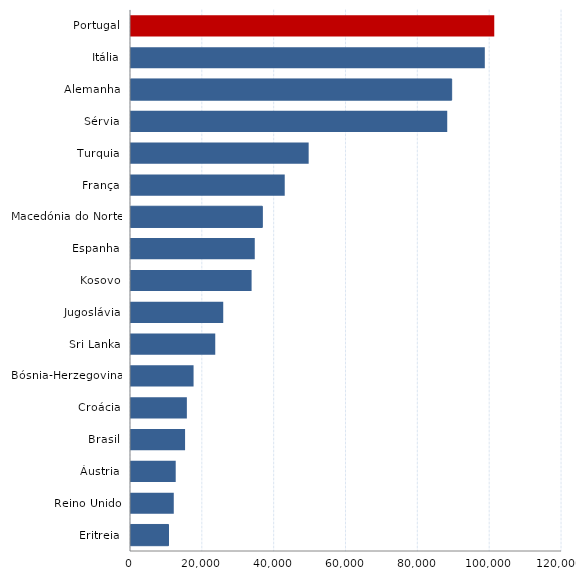
| Category | Series 0 |
|---|---|
| Portugal | 101138 |
| Itália | 98509 |
| Alemanha | 89281 |
| Sérvia | 88047 |
| Turquia | 49465 |
| França | 42803 |
| Macedónia do Norte | 36564 |
| Espanha | 34458 |
| Kosovo | 33573 |
| Jugoslávia | 25680 |
| Sri Lanka | 23459 |
| Bósnia-Herzegovina | 17419 |
| Croácia | 15554 |
| Brasil | 15055 |
| Áustria | 12448 |
| Reino Unido | 11908 |
| Eritreia | 10443 |